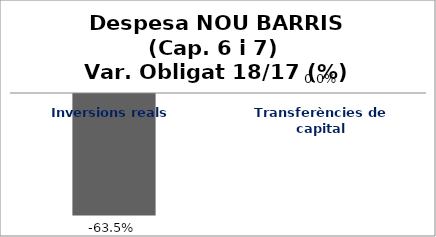
| Category | Series 0 |
|---|---|
| Inversions reals | -0.635 |
| Transferències de capital | 0 |